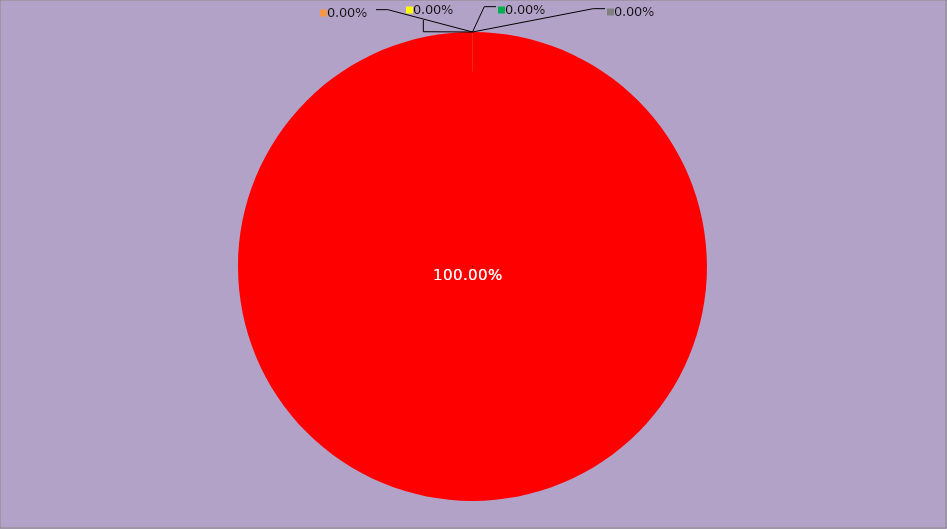
| Category | Année 2022 |
|---|---|
| Mesures non appliquées | 168 |
| Mesures appliquées mais peu ou pas documentées | 0 |
| Mesures appliquées et documentées | 0 |
| Mesures appliquées, documentées et contrôlées | 0 |
| Mesures non applicables | 0 |